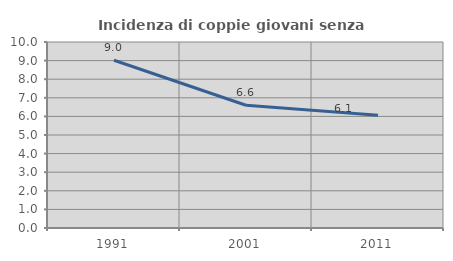
| Category | Incidenza di coppie giovani senza figli |
|---|---|
| 1991.0 | 9.02 |
| 2001.0 | 6.601 |
| 2011.0 | 6.057 |